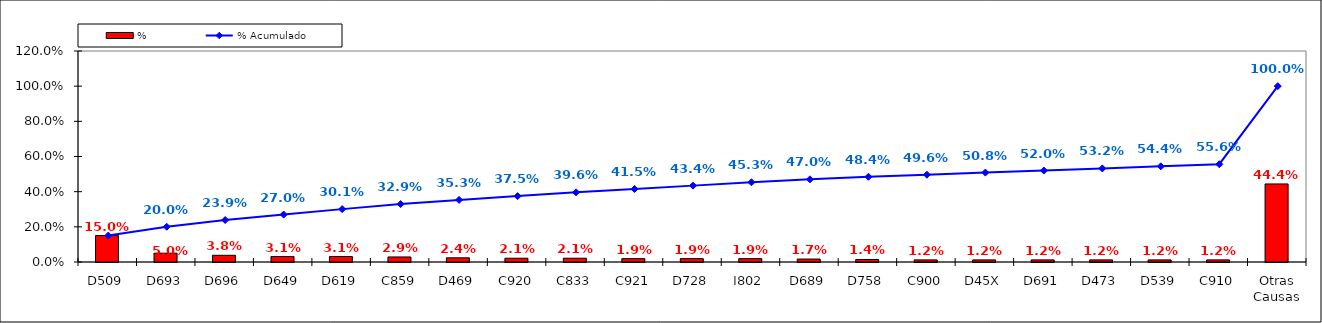
| Category | % |
|---|---|
| D509 | 0.15 |
| D693 | 0.05 |
| D696 | 0.038 |
| D649 | 0.031 |
| D619 | 0.031 |
| C859 | 0.029 |
| D469 | 0.024 |
| C920 | 0.021 |
| C833 | 0.021 |
| C921 | 0.019 |
| D728 | 0.019 |
| I802 | 0.019 |
| D689 | 0.017 |
| D758 | 0.014 |
| C900 | 0.012 |
| D45X | 0.012 |
| D691 | 0.012 |
| D473 | 0.012 |
| D539 | 0.012 |
| C910 | 0.012 |
| Otras Causas | 0.444 |